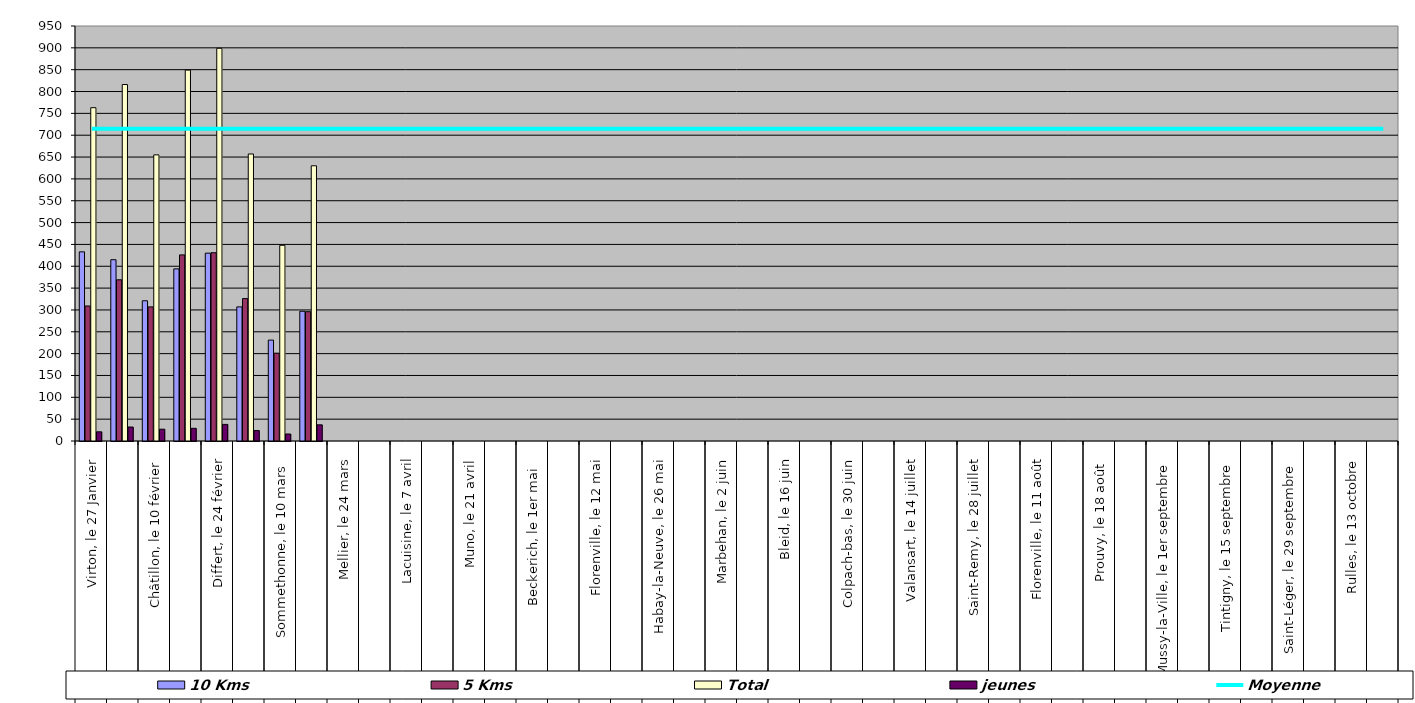
| Category | 10 Kms | 5 Kms | Total | jeunes |
|---|---|---|---|---|
| 0 | 433 | 309 | 763 | 21 |
| 1 | 415 | 369 | 816 | 32 |
| 2 | 321 | 307 | 655 | 27 |
| 3 | 394 | 426 | 849 | 29 |
| 4 | 430 | 431 | 899 | 38 |
| 5 | 307 | 326 | 657 | 24 |
| 6 | 231 | 201 | 448 | 16 |
| 7 | 297 | 296 | 630 | 37 |
| 8 | 0 | 0 | 0 | 0 |
| 9 | 0 | 0 | 0 | 0 |
| 10 | 0 | 0 | 0 | 0 |
| 11 | 0 | 0 | 0 | 0 |
| 12 | 0 | 0 | 0 | 0 |
| 13 | 0 | 0 | 0 | 0 |
| 14 | 0 | 0 | 0 | 0 |
| 15 | 0 | 0 | 0 | 0 |
| 16 | 0 | 0 | 0 | 0 |
| 17 | 0 | 0 | 0 | 0 |
| 18 | 0 | 0 | 0 | 0 |
| 19 | 0 | 0 | 0 | 0 |
| 20 | 0 | 0 | 0 | 0 |
| 21 | 0 | 0 | 0 | 0 |
| 22 | 0 | 0 | 0 | 0 |
| 23 | 0 | 0 | 0 | 0 |
| 24 | 0 | 0 | 0 | 0 |
| 25 | 0 | 0 | 0 | 0 |
| 26 | 0 | 0 | 0 | 0 |
| 27 | 0 | 0 | 0 | 0 |
| 28 | 0 | 0 | 0 | 0 |
| 29 | 0 | 0 | 0 | 0 |
| 30 | 0 | 0 | 0 | 0 |
| 31 | 0 | 0 | 0 | 0 |
| 32 | 0 | 0 | 0 | 0 |
| 33 | 0 | 0 | 0 | 0 |
| 34 | 0 | 0 | 0 | 0 |
| 35 | 0 | 0 | 0 | 0 |
| 36 | 0 | 0 | 0 | 0 |
| 37 | 0 | 0 | 0 | 0 |
| 38 | 0 | 0 | 0 | 0 |
| 39 | 0 | 0 | 0 | 0 |
| 40 | 0 | 0 | 0 | 0 |
| 41 | 0 | 0 | 0 | 0 |